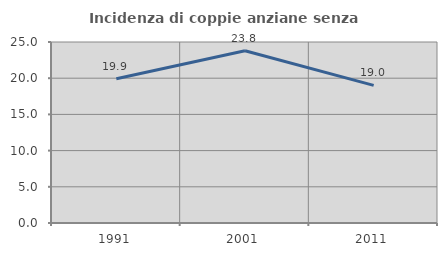
| Category | Incidenza di coppie anziane senza figli  |
|---|---|
| 1991.0 | 19.932 |
| 2001.0 | 23.792 |
| 2011.0 | 19.008 |